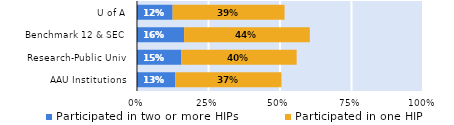
| Category | Participated in two or more HIPs | Participated in one HIP |
|---|---|---|
| AAU Institutions | 0.134 | 0.371 |
| Research-Public Univ | 0.155 | 0.403 |
| Benchmark 12 & SEC | 0.165 | 0.439 |
| U of A | 0.125 | 0.391 |